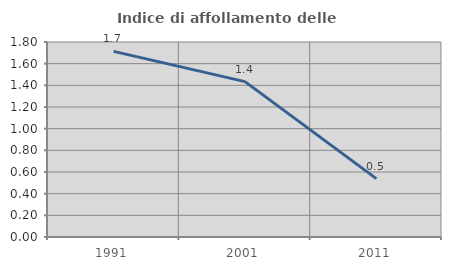
| Category | Indice di affollamento delle abitazioni  |
|---|---|
| 1991.0 | 1.713 |
| 2001.0 | 1.434 |
| 2011.0 | 0.539 |